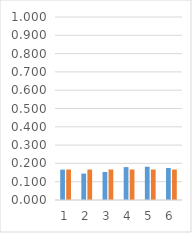
| Category | rel freq | prob |
|---|---|---|
| 0 | 0.166 | 0.167 |
| 1 | 0.144 | 0.167 |
| 2 | 0.153 | 0.167 |
| 3 | 0.18 | 0.167 |
| 4 | 0.182 | 0.167 |
| 5 | 0.175 | 0.167 |